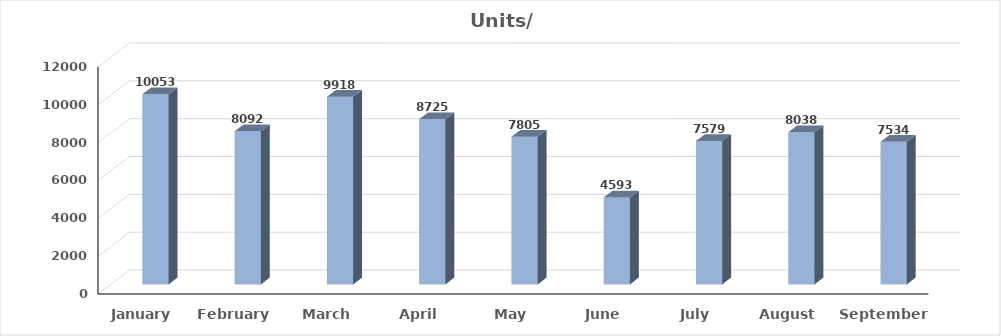
| Category | Units |
|---|---|
| January | 10053 |
| February | 8092 |
| March | 9918 |
| April | 8725 |
| May | 7805 |
| June | 4593 |
| July | 7579 |
| August | 8038 |
| September | 7534 |